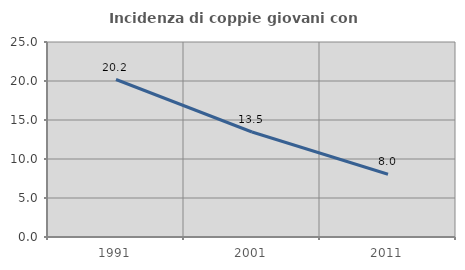
| Category | Incidenza di coppie giovani con figli |
|---|---|
| 1991.0 | 20.189 |
| 2001.0 | 13.462 |
| 2011.0 | 8.046 |